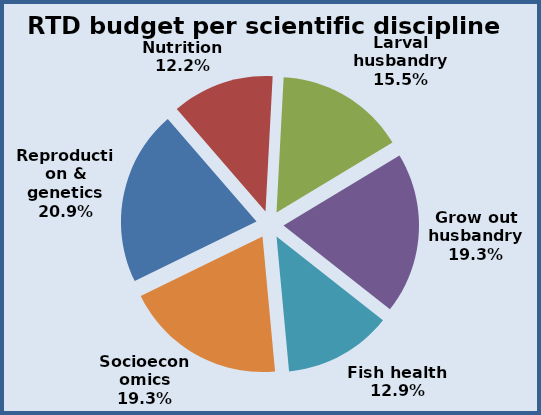
| Category | Series 0 |
|---|---|
| Reproduction & genetics | 0.209 |
| Nutrition | 0.122 |
| Larval husbandry | 0.155 |
| Grow out husbandry | 0.193 |
| Fish health | 0.129 |
| Socioeconomics | 0.193 |